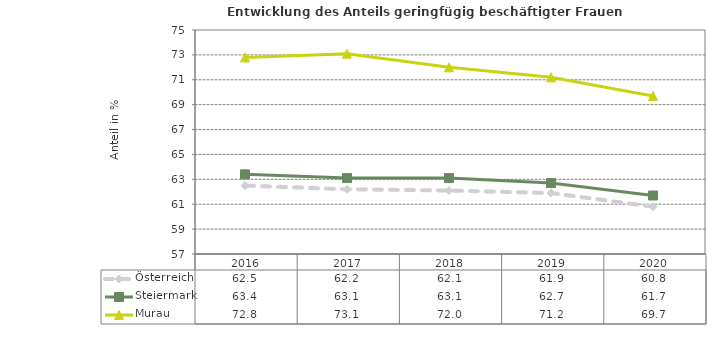
| Category | Österreich | Steiermark | Murau |
|---|---|---|---|
| 2020.0 | 60.8 | 61.7 | 69.7 |
| 2019.0 | 61.9 | 62.7 | 71.2 |
| 2018.0 | 62.1 | 63.1 | 72 |
| 2017.0 | 62.2 | 63.1 | 73.1 |
| 2016.0 | 62.5 | 63.4 | 72.8 |